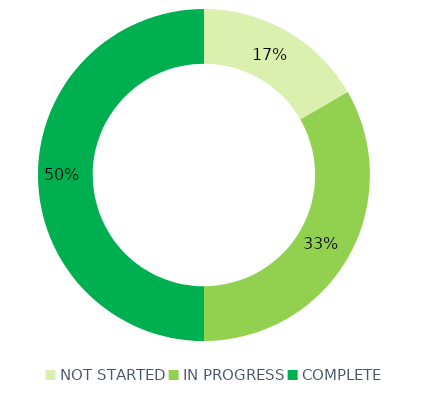
| Category | Series 0 |
|---|---|
| NOT STARTED | 1 |
| IN PROGRESS | 2 |
| COMPLETE | 3 |